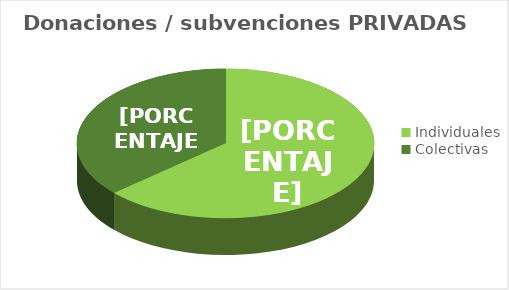
| Category | Series 0 |
|---|---|
| Individuales | 1337.18 |
| Colectivas | 770.71 |